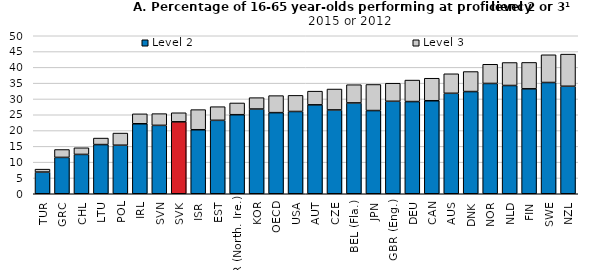
| Category | Level 2 | Level 3 |
|---|---|---|
| TUR | 6.867 | 0.925 |
| GRC | 11.502 | 2.501 |
| CHL | 12.45 | 2.101 |
| LTU | 15.564 | 2.058 |
| POL | 15.36 | 3.845 |
| IRL | 22.149 | 3.143 |
| SVN | 21.646 | 3.71 |
| SVK | 22.761 | 2.868 |
| ISR | 20.255 | 6.37 |
| EST | 23.237 | 4.319 |
| GBR (North. Ire.) | 25.02 | 3.713 |
| KOR | 26.814 | 3.596 |
| OECD | 25.671 | 5.382 |
| USA | 26.038 | 5.098 |
| AUT | 28.14 | 4.328 |
| CZE | 26.532 | 6.612 |
| BEL (Fla.) | 28.745 | 5.765 |
| JPN | 26.333 | 8.252 |
| GBR (Eng.) | 29.265 | 5.714 |
| DEU | 29.173 | 6.803 |
| CAN | 29.432 | 7.124 |
| AUS | 31.793 | 6.177 |
| DNK | 32.342 | 6.33 |
| NOR | 34.908 | 6.072 |
| NLD | 34.258 | 7.276 |
| FIN | 33.209 | 8.352 |
| SWE | 35.208 | 8.772 |
| NZL | 34.015 | 10.173 |